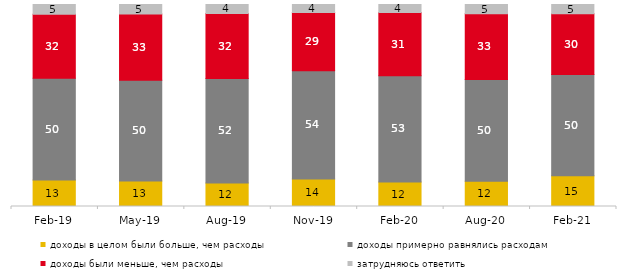
| Category | доходы в целом были больше, чем расходы | доходы примерно равнялись расходам | доходы были меньше, чем расходы | затрудняюсь ответить |
|---|---|---|---|---|
| 2019-02-01 | 13.1 | 50.4 | 31.65 | 4.85 |
| 2019-05-01 | 12.63 | 49.926 | 32.739 | 4.705 |
| 2019-08-01 | 11.688 | 51.648 | 32.218 | 4.446 |
| 2019-11-01 | 13.564 | 53.614 | 28.812 | 4.01 |
| 2020-02-01 | 12.079 | 52.673 | 31.238 | 4.01 |
| 2020-08-01 | 12.463 | 50.397 | 32.522 | 4.618 |
| 2021-02-01 | 15.186 | 50.174 | 30.025 | 4.615 |